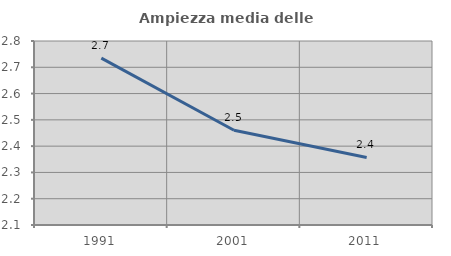
| Category | Ampiezza media delle famiglie |
|---|---|
| 1991.0 | 2.735 |
| 2001.0 | 2.461 |
| 2011.0 | 2.357 |